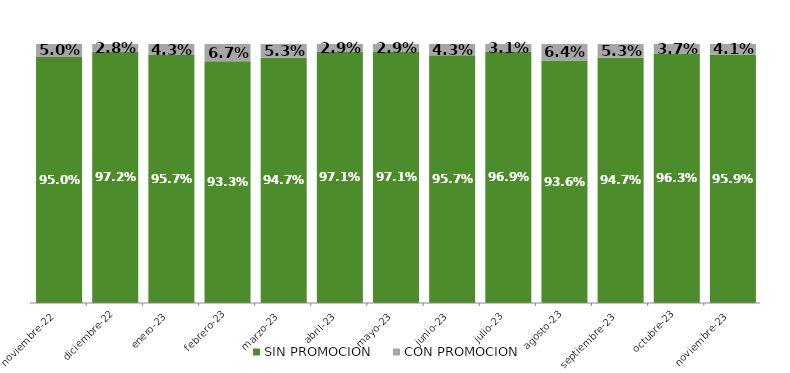
| Category | SIN PROMOCION   | CON PROMOCION   |
|---|---|---|
| 2022-11-01 | 0.95 | 0.05 |
| 2022-12-01 | 0.972 | 0.028 |
| 2023-01-01 | 0.957 | 0.043 |
| 2023-02-01 | 0.933 | 0.067 |
| 2023-03-01 | 0.947 | 0.053 |
| 2023-04-01 | 0.971 | 0.029 |
| 2023-05-01 | 0.971 | 0.029 |
| 2023-06-01 | 0.957 | 0.043 |
| 2023-07-01 | 0.969 | 0.031 |
| 2023-08-01 | 0.936 | 0.064 |
| 2023-09-01 | 0.947 | 0.053 |
| 2023-10-01 | 0.963 | 0.037 |
| 2023-11-01 | 0.959 | 0.041 |